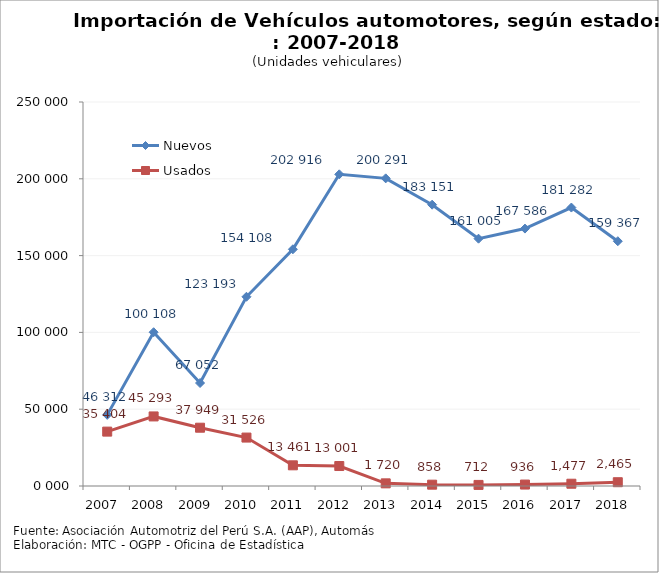
| Category | Nuevos | Usados |
|---|---|---|
| 2007.0 | 46312 | 35404 |
| 2008.0 | 100108 | 45293 |
| 2009.0 | 67052 | 37949 |
| 2010.0 | 123193 | 31526 |
| 2011.0 | 154108 | 13461 |
| 2012.0 | 202916 | 13001 |
| 2013.0 | 200291 | 1720 |
| 2014.0 | 183151 | 858 |
| 2015.0 | 161005 | 712 |
| 2016.0 | 167586 | 936 |
| 2017.0 | 181282 | 1477 |
| 2018.0 | 159367 | 2465 |